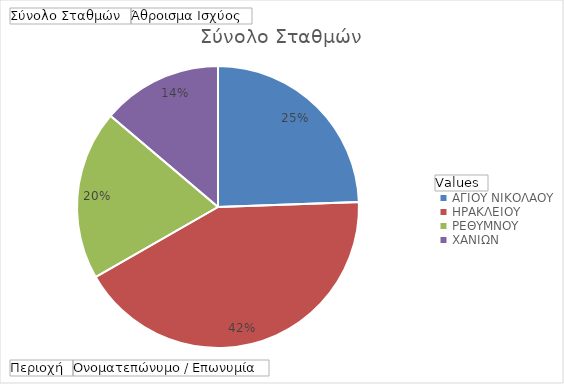
| Category | Σύνολο Σταθμών | Άθροισμα Ισχύος |
|---|---|---|
| ΑΓΙΟΥ ΝΙΚΟΛΑΟΥ | 255 | 19354.729 |
| ΗΡΑΚΛΕΙΟΥ | 441 | 32080.468 |
| ΡΕΘΥΜΝΟΥ | 203 | 15544.715 |
| ΧΑΝΙΩΝ | 144 | 11009.35 |